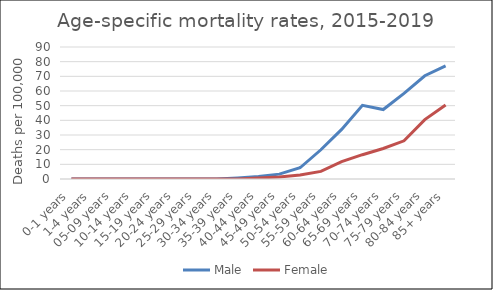
| Category | Male | Female |
|---|---|---|
| 0-1 years | 0 | 0 |
| 1-4 years | 0 | 0 |
| 05-09 years | 0 | 0 |
| 10-14 years | 0 | 0 |
| 15-19 years | 0 | 0 |
| 20-24 years | 0 | 0 |
| 25-29 years | 0 | 0 |
| 30-34 years | 0 | 0 |
| 35-39 years | 0.72 | 0 |
| 40-44 years | 1.72 | 0.72 |
| 45-49 years | 3.32 | 1.34 |
| 50-54 years | 7.66 | 2.67 |
| 55-59 years | 19.93 | 5.18 |
| 60-64 years | 33.8 | 11.85 |
| 65-69 years | 50.2 | 16.57 |
| 70-74 years | 47.36 | 20.8 |
| 75-79 years | 58.36 | 26.05 |
| 80-84 years | 70.4 | 40.49 |
| 85+ years | 77.07 | 50.5 |